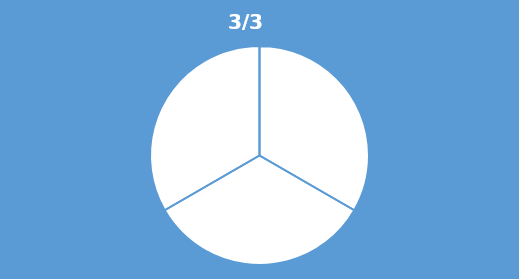
| Category | Series 0 |
|---|---|
| 0 | 0.333 |
| 1 | 0.333 |
| 2 | 0.333 |